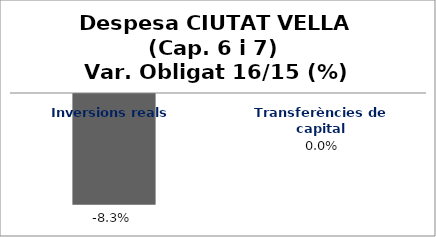
| Category | Series 0 |
|---|---|
| Inversions reals | -0.083 |
| Transferències de capital | 0 |